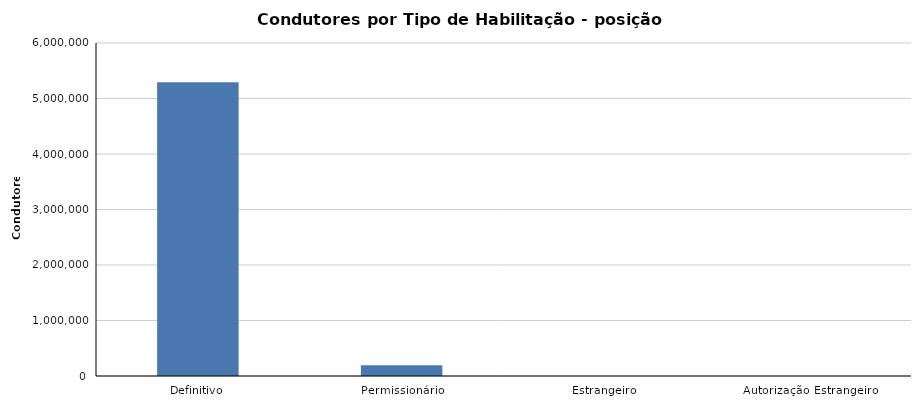
| Category | 2024/Maio |
|---|---|
| Definitivo | 5292483 |
| Permissionário | 193291 |
| Estrangeiro | 2 |
| Autorização Estrangeiro | 0 |